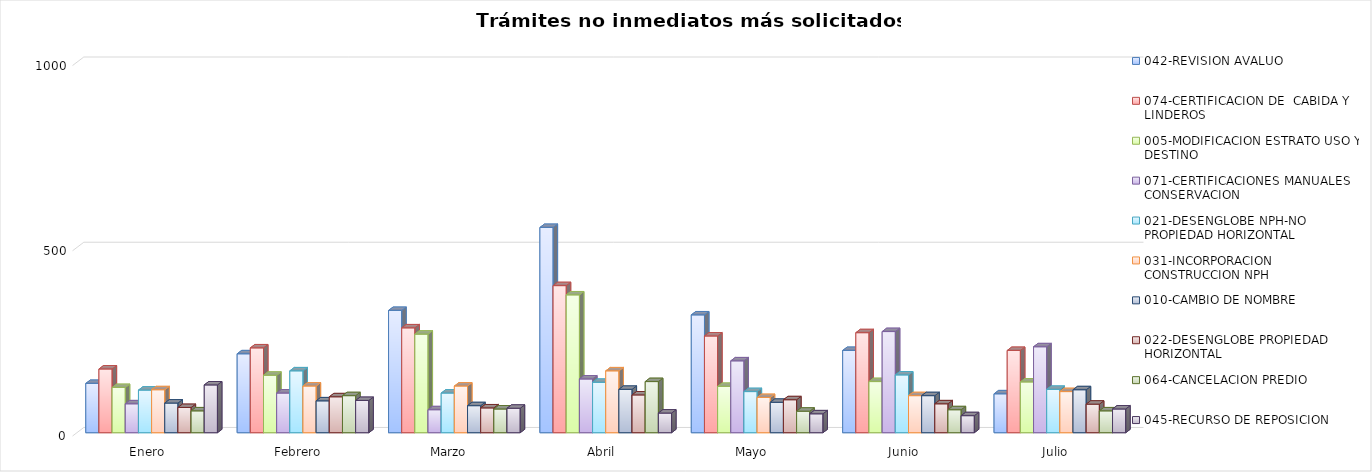
| Category | 042-REVISION AVALUO | 074-CERTIFICACION DE  CABIDA Y LINDEROS  | 005-MODIFICACION ESTRATO USO Y DESTINO | 071-CERTIFICACIONES MANUALES CONSERVACION | 021-DESENGLOBE NPH-NO PROPIEDAD HORIZONTAL | 031-INCORPORACION CONSTRUCCION NPH | 010-CAMBIO DE NOMBRE | 022-DESENGLOBE PROPIEDAD HORIZONTAL | 064-CANCELACION PREDIO | 045-RECURSO DE REPOSICION |
|---|---|---|---|---|---|---|---|---|---|---|
| Enero | 133 | 172 | 122 | 78 | 115 | 116 | 80 | 68 | 59 | 129 |
| Febrero | 213 | 229 | 155 | 107 | 167 | 126 | 86 | 97 | 100 | 87 |
| Marzo | 330 | 283 | 266 | 62 | 107 | 126 | 73 | 67 | 64 | 66 |
| Abril | 554 | 397 | 372 | 145 | 136 | 167 | 117 | 102 | 138 | 53 |
| Mayo | 318 | 261 | 125 | 194 | 111 | 95 | 82 | 89 | 58 | 51 |
| Junio | 222 | 270 | 138 | 273 | 156 | 100 | 100 | 78 | 62 | 46 |
| Julio | 105 | 222 | 137 | 232 | 117 | 111 | 116 | 77 | 59 | 64 |